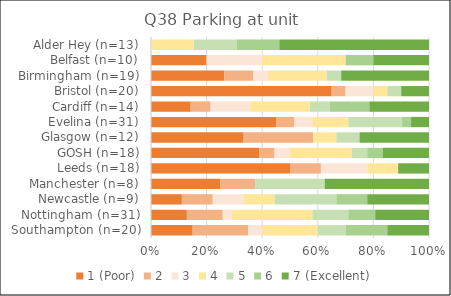
| Category | 1 (Poor) | 2 | 3 | 4 | 5 | 6 | 7 (Excellent) |
|---|---|---|---|---|---|---|---|
| Southampton (n=20) | 3 | 4 | 1 | 4 | 2 | 3 | 3 |
| Nottingham (n=31) | 4 | 4 | 1 | 9 | 4 | 3 | 6 |
| Newcastle (n=9) | 1 | 1 | 1 | 1 | 2 | 1 | 2 |
| Manchester (n=8) | 2 | 1 | 0 | 0 | 2 | 0 | 3 |
| Leeds (n=18) | 9 | 2 | 3 | 2 | 0 | 0 | 2 |
| GOSH (n=18) | 7 | 1 | 1 | 4 | 1 | 1 | 3 |
| Glasgow (n=12) | 4 | 3 | 0 | 1 | 1 | 0 | 3 |
| Evelina (n=31) | 14 | 2 | 2 | 4 | 6 | 1 | 2 |
| Cardiff (n=14) | 2 | 1 | 2 | 3 | 1 | 2 | 3 |
| Bristol (n=20) | 13 | 1 | 2 | 1 | 1 | 0 | 2 |
| Birmingham (n=19) | 5 | 2 | 1 | 4 | 1 | 0 | 6 |
| Belfast (n=10) | 2 | 0 | 2 | 3 | 0 | 1 | 2 |
| Alder Hey (n=13) | 0 | 0 | 0 | 2 | 2 | 2 | 7 |